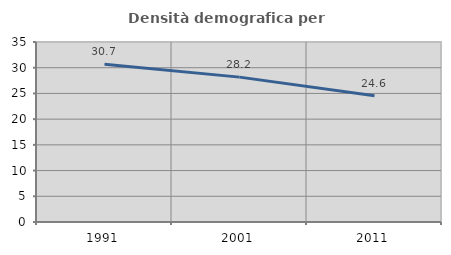
| Category | Densità demografica |
|---|---|
| 1991.0 | 30.683 |
| 2001.0 | 28.17 |
| 2011.0 | 24.557 |